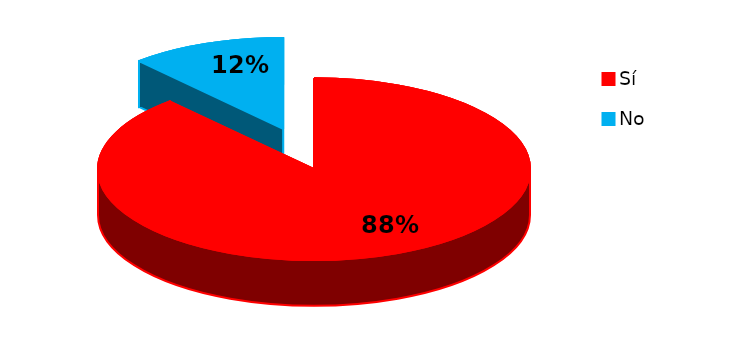
| Category | Series 0 |
|---|---|
| 0 | 38 |
| 1 | 5 |